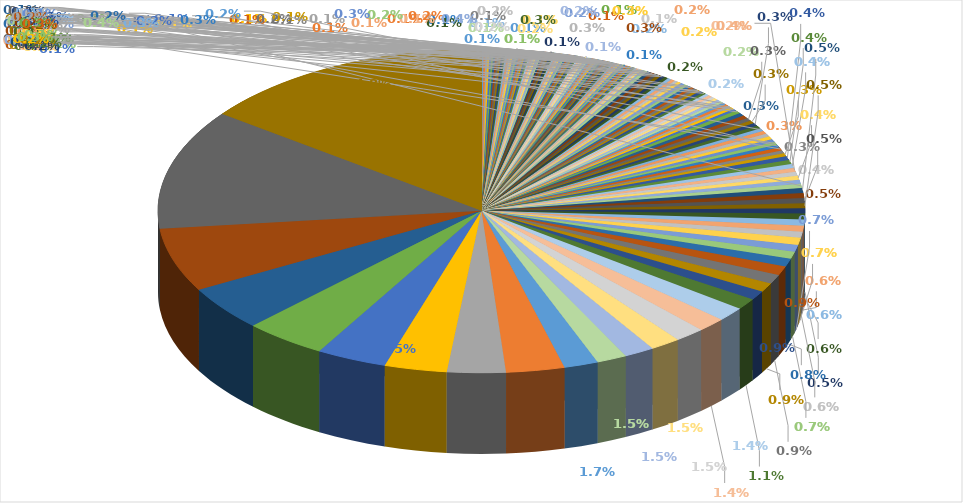
| Category | Series 0 |
|---|---|
| Acta Geophysica | 0.001 |
| Acta Oecologica | 0.001 |
| Advances in Interpretation of Geological Processes: Refinement of Multi-Scale Data and Integration in Numerical Modelling | 0.001 |
| Applied Geomatics  | 0.001 |
| ArcheoSciences  | 0.001 |
| Artificial Intelligence in Geosciences  | 0.001 |
| Astronomy and Astrophysics | 0.001 |
| Atmosphere | 0.001 |
| Atmospheric Measurement Techniques | 0.001 |
| Atmospheric Research | 0.001 |
| Atmospheric Science Letters | 0.001 |
| Basin Research | 0.001 |
| BDG-Mitt.-Bl. | 0.001 |
| Boletin Geologico y Minero | 0.001 |
| Bulletin d'Informations Marées Terrestres | 0.001 |
| Bulletin of Volcanology  | 0.001 |
| Clay Minerals | 0.001 |
| Continental Shelf Research | 0.001 |
| D-A-CH-Mitt.-Bl | 0.001 |
| Data in Brief | 0.001 |
| Deep Sea Research Part II: Topical Studies in Oceanography | 0.001 |
| Docklady Earth Sciences | 0.001 |
| Earth and Space Science Open Archive | 0.001 |
| Earth System Science Data Discussions | 0.001 |
| Earthquake Science  | 0.001 |
| Engineering Structures | 0.001 |
| Entropy | 0.001 |
| First Break Special Issue on Passive Seismics | 0.001 |
| Gemeins. Sekretariat, Bull | 0.001 |
| Geophysical Prospecting | 0.001 |
| Geosciences | 0.001 |
| Geosphere | 0.001 |
| Geothermics | 0.001 |
| Global and Planetary Change | 0.001 |
| Groundwater | 0.001 |
| Gyroscopy and Navigation  | 0.001 |
| Holocene  | 0.001 |
| Hydrogeology Journal | 0.001 |
| IEEE signal Processing Magazine | 0.001 |
| IEEE Transactions on Geoscience and Remote Sensing | 0.001 |
| IEEE Transactions on Instrumentation and Measurement | 0.001 |
| International Archives of the Photogrammetry Remote Sensing and Spatial Information Sciences  | 0.001 |
| International Journal of Civil Engineering | 0.001 |
| International Journal of Phytoremediation | 0.001 |
| International Journal of Speleology  | 0.001 |
| Izvestiya, Physics of the Solid Earth  | 0.001 |
| Journal International des Sciences de la Vigne et du Vin | 0.001 |
| Journal of African Earth Sciences | 0.001 |
| Journal of Applied Geodesy | 0.001 |
| Journal of Archaeological Science | 0.001 |
| Journal of Basic and Applied Advances in Sciences | 0.001 |
| Journal of Coastal Research | 0.001 |
| Journal of Environmental and Engineering Geophysics | 0.001 |
| Journal of Geodetic Science | 0.001 |
| Journal of Geosciences | 0.001 |
| Journal of Natural Disasters | 0.001 |
| Journal of the Geological Society | 0.001 |
| Landslide Science and Practice: Landslide Inventory and Susceptibility and Hazard Zoning  | 0.001 |
| Landslides | 0.001 |
| Marine Geodesy | 0.001 |
| Marine Geophysical Researches | 0.001 |
| Nature  | 0.001 |
| Nature Climate Change  | 0.001 |
| Nature Scientific Reports | 0.001 |
| Near Surface Geophysics | 0.001 |
| Netherland Journal of Geosciences/Geologie en Mijnbouw | 0.001 |
| Physical Research Letters | 0.001 |
| Planetary and Space Science | 0.001 |
| Polar Research | 0.001 |
| Procedia Engineering | 0.001 |
| Proceedings of the National Academy of Sciences of the United States of America  | 0.001 |
| Radio Science | 0.001 |
| Reports on Progress in Physics | 0.001 |
| Russian Geology and Geophysics | 0.001 |
| Science Advances | 0.001 |
| Sensors | 0.001 |
| Shock and Vibration | 0.001 |
| Signal Processing | 0.001 |
| Structural Health Monitoring - An International Journal  | 0.001 |
| Tellus Series A-Dynamic Meteorology and Oceanography  | 0.001 |
| Terra Nova | 0.001 |
| The European Physical Journal D | 0.001 |
| Vadose Zone Journal | 0.001 |
| Annales Geophysicae | 0.002 |
| Annals of Geophysics | 0.002 |
| Applied Physics B | 0.002 |
| Applied Physics Letters | 0.002 |
| Bollettino of Geofisica Teorica ed Applicata | 0.002 |
| Comptes Rendus de l'Académie des Sciences - Series IIA - Earth and Planetary Science | 0.002 |
| Computers & Geosciences | 0.002 |
| Earth Surface Dynamics | 0.002 |
| Environmental Earth Sciences  | 0.002 |
| EOS Transactions American Geophysical Union | 0.002 |
| Geoscientific Instrumentation Methods and Data Systems | 0.002 |
| Gondwana Research  | 0.002 |
| IEEE Journal of Selected Topics in Applied Earth Observations and Remote Sensing | 0.002 |
| International Journal of Earth Sciences | 0.002 |
| Journal of Atmospheric and Solar-Terrestrial Physics | 0.002 |
| Journal of Coastal Research | 0.002 |
| Journal of Earthquake Engineering | 0.002 |
| Journal of Hydrology | 0.002 |
| Journal of Hydrometeorology  | 0.002 |
| Journal of South American Earth Sciences | 0.002 |
| Journal of Space Weather and Space Climate  | 0.002 |
| Journal of Structural Geology | 0.002 |
| Journal of the Acoustical Society of America | 0.002 |
| Meteorologische Zeitschrift | 0.002 |
| Nature Communications | 0.002 |
| Nature Scientific Reports | 0.002 |
| New Journal of Physics | 0.002 |
| Reviews of Geophysics | 0.002 |
| Studia Geophysica et Geodaetica | 0.002 |
| The Cryosphere | 0.002 |
| Acta Geodaetica et Geophysica | 0.003 |
| Earth, Planets and Space | 0.003 |
| Earthquake Spectra  | 0.003 |
| Engineering Geology | 0.003 |
| Geological Society London Special Publications | 0.003 |
| Geomorphology | 0.003 |
| Geophysics | 0.003 |
| Gravity, Geoid and Earth Observation | 0.003 |
| International Journal of Disaster Risk Reduction  | 0.003 |
| Journal of Asian Earth Sciences | 0.003 |
| La Météorologie | 0.003 |
| Lithos | 0.003 |
| Natural Hazards and Earth System Sciences | 0.003 |
| Physics and Chemistry of the Earth | 0.003 |
| Revue Française de Metrologie  | 0.003 |
| Revue XYZ | 0.003 |
| Swiss Journal of Geosciences | 0.003 |
| Communications Earth & Environment | 0.004 |
| Geology  | 0.004 |
| Geotechnical, Geological and Earthquake Engineering  | 0.004 |
| Journal of Applied Geophysics  | 0.004 |
| Natural Hazards | 0.004 |
| Remote Sensing  | 0.004 |
| Soil Dynamics and Earthquake Engineering  | 0.004 |
| Surveys in Geophysics  | 0.004 |
| Advances in Space Research | 0.005 |
| Earthquake Engineering and Structural Dynamics | 0.005 |
| Geothermal Energy | 0.005 |
| Hydrology and Earth System Sciences  | 0.005 |
| Space Weather | 0.005 |
| GPS Solutions  | 0.006 |
| Physics of the Earth and Planetary Interiors  | 0.006 |
| Science | 0.006 |
| Tectonics  | 0.006 |
| Advances in Geosciences | 0.007 |
| Quarterly Journal of the Royal Meteorological Society  | 0.007 |
| Remote Sensing of Environment | 0.007 |
| Scientific Reports | 0.008 |
| Bulletin de la Société Géologique de France | 0.009 |
| Journal of Volcanology and Geothermal Research  | 0.009 |
| Nature Geoscience  | 0.009 |
| Physical Review A | 0.009 |
| Water Resources Research | 0.011 |
| Journal of Geodesy  | 0.014 |
| Metrologia  | 0.014 |
| Comptes Rendus Geoscience | 0.015 |
| Journal of Seismology  | 0.015 |
| Pure and Applied Geophysics | 0.015 |
| Solid Earth | 0.015 |
| Geochemistry, Geophysics, Geosystems  | 0.017 |
| Bulletin of Earthquake Engineering | 0.029 |
| Journal of Geodynamics  | 0.029 |
| Earth and Planetary Science Letters  | 0.031 |
| Tectonophysics | 0.035 |
| Seismological Research Letters  | 0.041 |
| Bulletin of the Seismological Society of America  | 0.044 |
| Geophysical Research Letters  | 0.063 |
| Journal of Geophysical Research | 0.12 |
| Geophysical Journal International  | 0.148 |